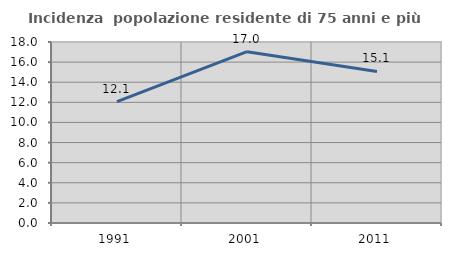
| Category | Incidenza  popolazione residente di 75 anni e più |
|---|---|
| 1991.0 | 12.069 |
| 2001.0 | 17.035 |
| 2011.0 | 15.074 |